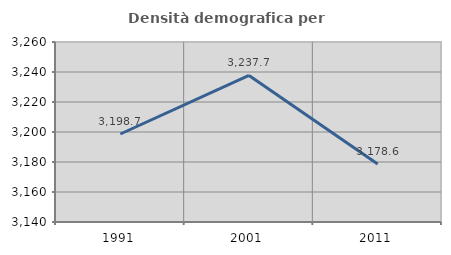
| Category | Densità demografica |
|---|---|
| 1991.0 | 3198.669 |
| 2001.0 | 3237.685 |
| 2011.0 | 3178.618 |